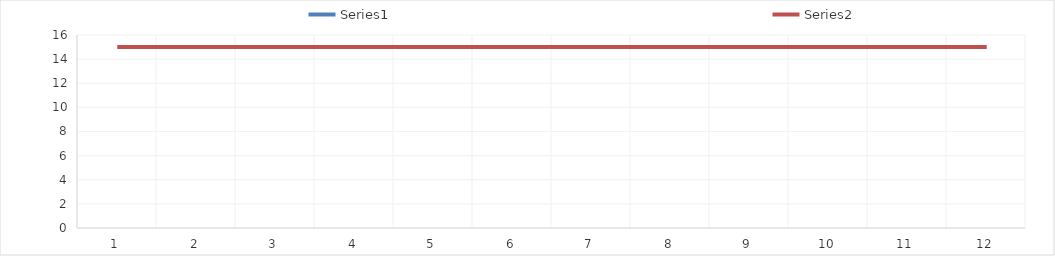
| Category | Series 0 | Series 1 |
|---|---|---|
| 0 | 15 | 15 |
| 1 | 15 | 15 |
| 2 | 15 | 15 |
| 3 | 15 | 15 |
| 4 | 15 | 15 |
| 5 | 15 | 15 |
| 6 | 15 | 15 |
| 7 | 15 | 15 |
| 8 | 15 | 15 |
| 9 | 15 | 15 |
| 10 | 15 | 15 |
| 11 | 15 | 15 |